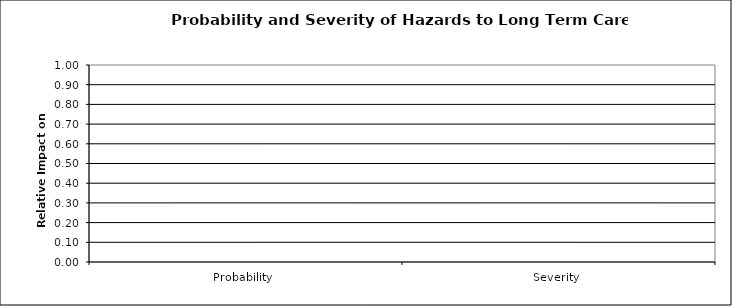
| Category | Series 0 |
|---|---|
| Probability | 0 |
| Severity | 0 |